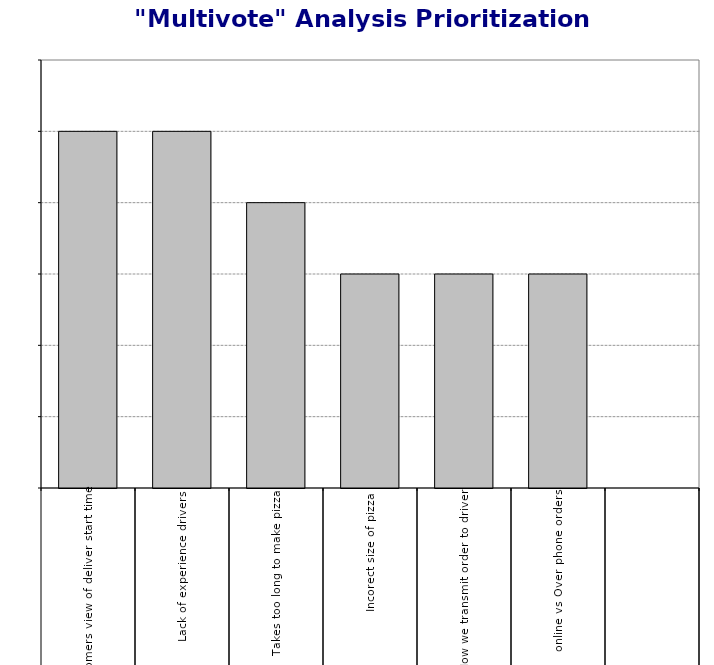
| Category | Series 0 |
|---|---|
| 0 | 5 |
| 1 | 5 |
| 2 | 4 |
| 3 | 3 |
| 4 | 3 |
| 5 | 3 |
| 6 | 0 |